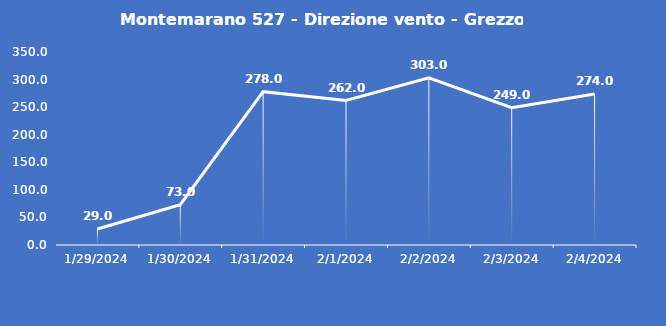
| Category | Montemarano 527 - Direzione vento - Grezzo (°N) |
|---|---|
| 1/29/24 | 29 |
| 1/30/24 | 73 |
| 1/31/24 | 278 |
| 2/1/24 | 262 |
| 2/2/24 | 303 |
| 2/3/24 | 249 |
| 2/4/24 | 274 |